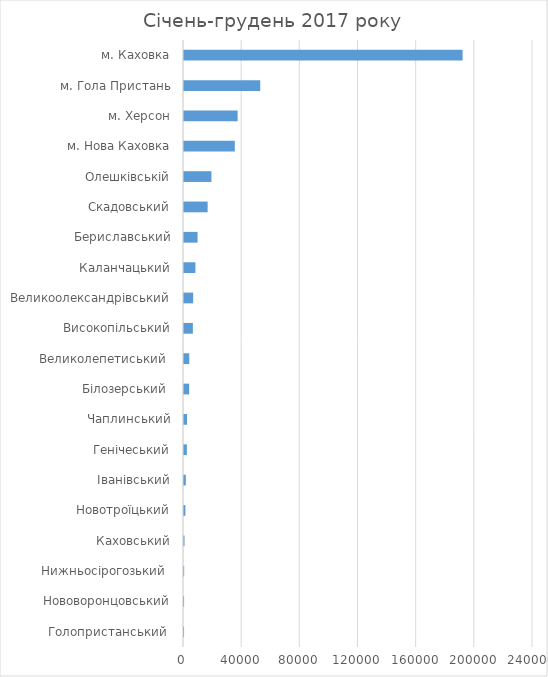
| Category | Series 0 |
|---|---|
| Голопристанський  | 30.2 |
| Нововоронцовський | 53.5 |
| Нижньосірогозький  | 101.4 |
| Каховський | 355.2 |
| Новотроїцький | 964.9 |
| Іванівський | 1244.1 |
| Генічеський | 1956.7 |
| Чаплинський | 2098.8 |
| Білозерський  | 3556.7 |
| Великолепетиський  | 3615.7 |
| Високопільський | 6099 |
| Великоолександрівський | 6317.8 |
| Каланчацький | 7838.9 |
| Бериславський | 9341.2 |
| Скадовський | 16265.8 |
| Олешківській | 18844.9 |
| м. Нова Каховка | 34932.9 |
| м. Херсон | 36884.5 |
| м. Гола Пристань | 52433.4 |
| м. Каховка | 191588.6 |